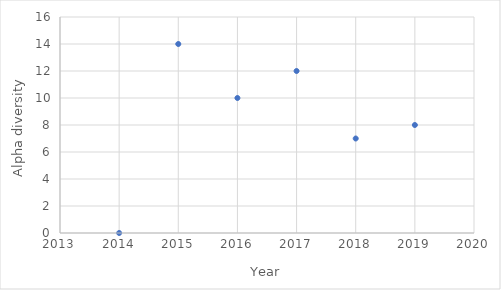
| Category | Alpha |
|---|---|
| 2014.0 | 0 |
| 2015.0 | 14 |
| 2016.0 | 10 |
| 2017.0 | 12 |
| 2018.0 | 7 |
| 2019.0 | 8 |